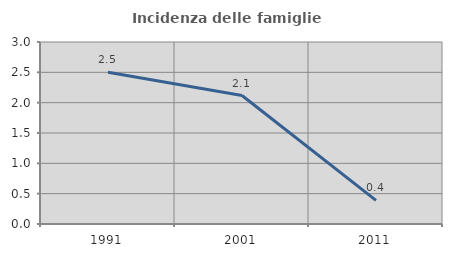
| Category | Incidenza delle famiglie numerose |
|---|---|
| 1991.0 | 2.5 |
| 2001.0 | 2.117 |
| 2011.0 | 0.389 |